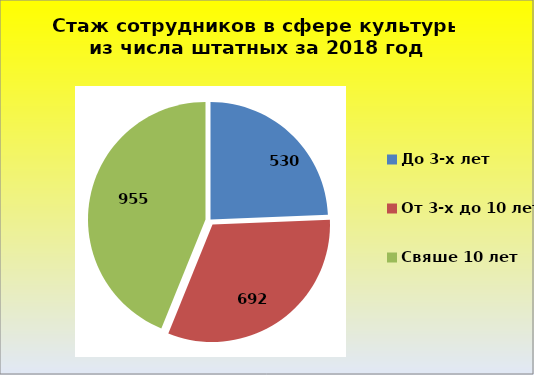
| Category | Series 0 |
|---|---|
| До 3-х лет | 530 |
| От 3-х до 10 лет | 692 |
| Свяше 10 лет | 955 |